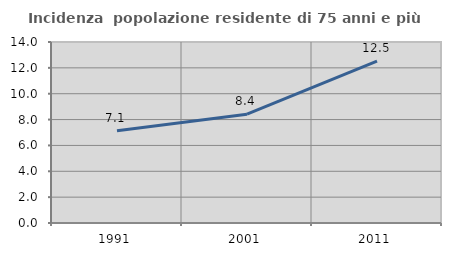
| Category | Incidenza  popolazione residente di 75 anni e più |
|---|---|
| 1991.0 | 7.139 |
| 2001.0 | 8.413 |
| 2011.0 | 12.519 |